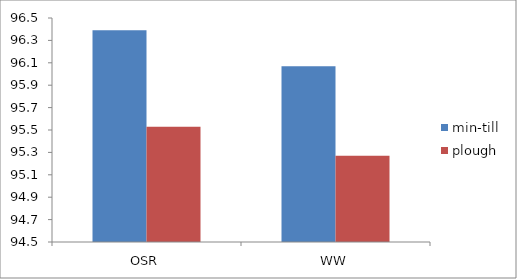
| Category | min-till | plough |
|---|---|---|
| OSR | 96.39 | 95.53 |
| WW | 96.07 | 95.27 |